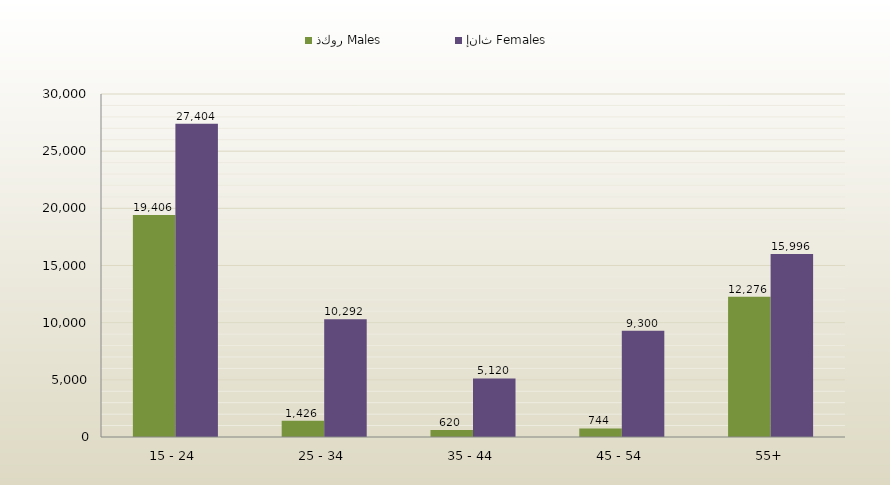
| Category | ذكور Males | إناث Females |
|---|---|---|
| 15 - 24 | 19406 | 27404 |
| 25 - 34 | 1426 | 10292 |
| 35 - 44 | 620 | 5120 |
| 45 - 54 | 744 | 9300 |
| 55+ | 12276 | 15996 |